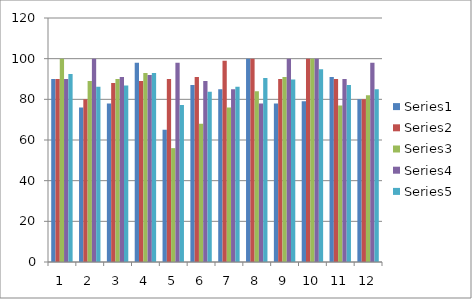
| Category | Series 0 | Series 1 | Series 2 | Series 3 | Series 4 |
|---|---|---|---|---|---|
| 0 | 90 | 90 | 100 | 90 | 92.5 |
| 1 | 76 | 80 | 89 | 100 | 86.25 |
| 2 | 78 | 88 | 90 | 91 | 86.75 |
| 3 | 98 | 89 | 93 | 92 | 93 |
| 4 | 65 | 90 | 56 | 98 | 77.25 |
| 5 | 87 | 91 | 68 | 89 | 83.75 |
| 6 | 85 | 99 | 76 | 85 | 86.25 |
| 7 | 100 | 100 | 84 | 78 | 90.5 |
| 8 | 78 | 90 | 91 | 100 | 89.75 |
| 9 | 79 | 100 | 100 | 100 | 94.75 |
| 10 | 91 | 90 | 77 | 90 | 87 |
| 11 | 80 | 80 | 82 | 98 | 85 |